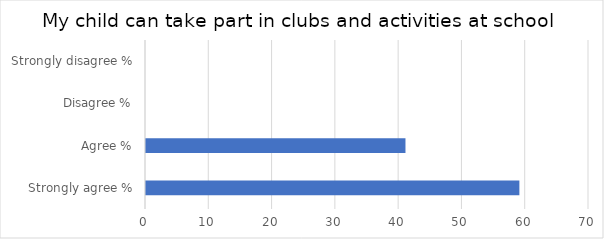
| Category | Series 1 |
|---|---|
| Strongly agree % | 59 |
| Agree % | 41 |
| Disagree % | 0 |
| Strongly disagree % | 0 |